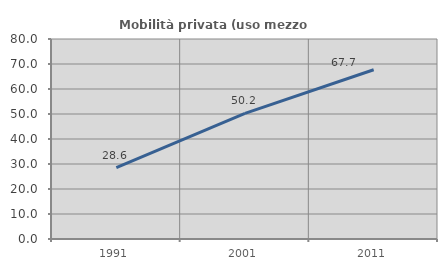
| Category | Mobilità privata (uso mezzo privato) |
|---|---|
| 1991.0 | 28.596 |
| 2001.0 | 50.218 |
| 2011.0 | 67.686 |